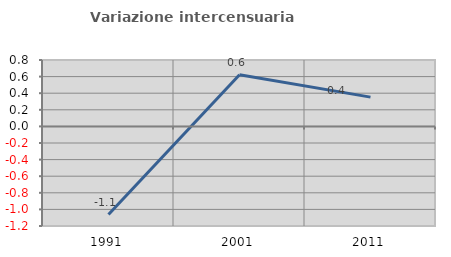
| Category | Variazione intercensuaria annua |
|---|---|
| 1991.0 | -1.062 |
| 2001.0 | 0.623 |
| 2011.0 | 0.353 |